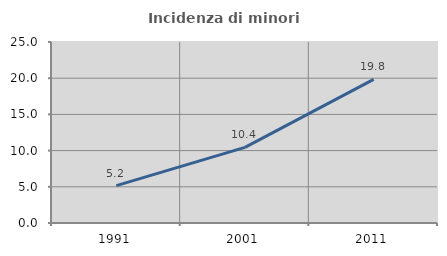
| Category | Incidenza di minori stranieri |
|---|---|
| 1991.0 | 5.161 |
| 2001.0 | 10.445 |
| 2011.0 | 19.835 |